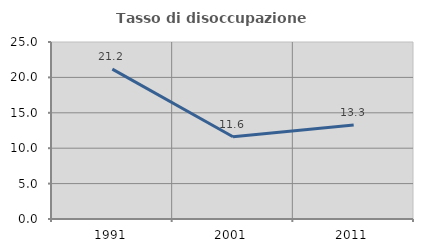
| Category | Tasso di disoccupazione giovanile  |
|---|---|
| 1991.0 | 21.176 |
| 2001.0 | 11.613 |
| 2011.0 | 13.265 |